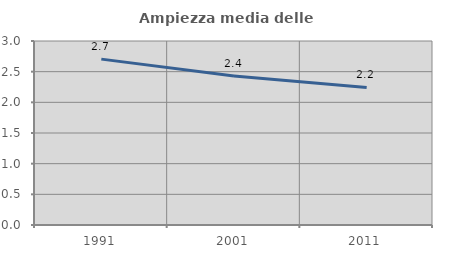
| Category | Ampiezza media delle famiglie |
|---|---|
| 1991.0 | 2.704 |
| 2001.0 | 2.43 |
| 2011.0 | 2.242 |